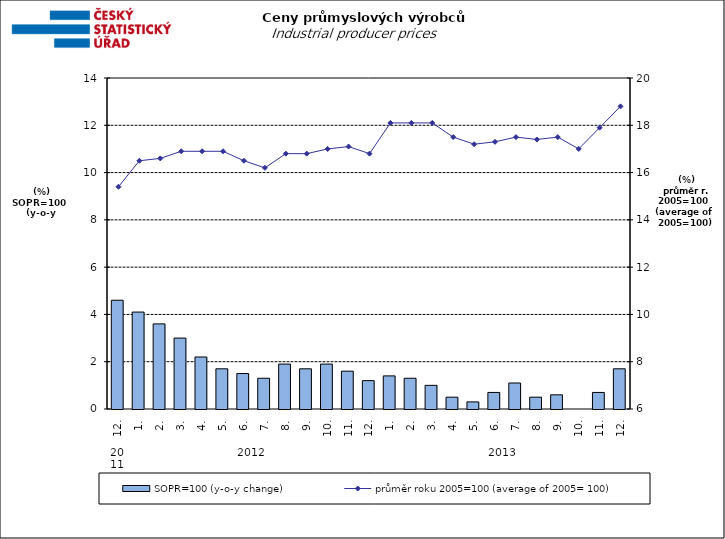
| Category | SOPR=100 (y-o-y change)   |
|---|---|
| 0 | 4.6 |
| 1 | 4.1 |
| 2 | 3.6 |
| 3 | 3 |
| 4 | 2.2 |
| 5 | 1.7 |
| 6 | 1.5 |
| 7 | 1.3 |
| 8 | 1.9 |
| 9 | 1.7 |
| 10 | 1.9 |
| 11 | 1.6 |
| 12 | 1.2 |
| 13 | 1.4 |
| 14 | 1.3 |
| 15 | 1 |
| 16 | 0.5 |
| 17 | 0.3 |
| 18 | 0.7 |
| 19 | 1.1 |
| 20 | 0.5 |
| 21 | 0.6 |
| 22 | 0 |
| 23 | 0.7 |
| 24 | 1.7 |